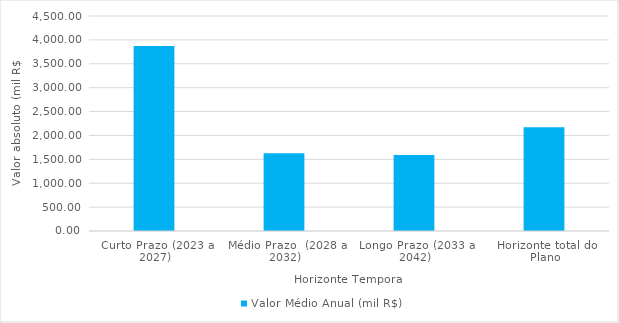
| Category | Valor Médio Anual (mil R$) |
|---|---|
| Curto Prazo (2023 a 2027) | 3869.693 |
| Médio Prazo  (2028 a 2032) | 1629.785 |
| Longo Prazo (2033 a 2042) | 1591.508 |
| Horizonte total do Plano | 2170.624 |